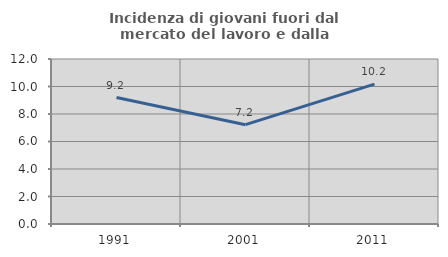
| Category | Incidenza di giovani fuori dal mercato del lavoro e dalla formazione  |
|---|---|
| 1991.0 | 9.199 |
| 2001.0 | 7.224 |
| 2011.0 | 10.169 |